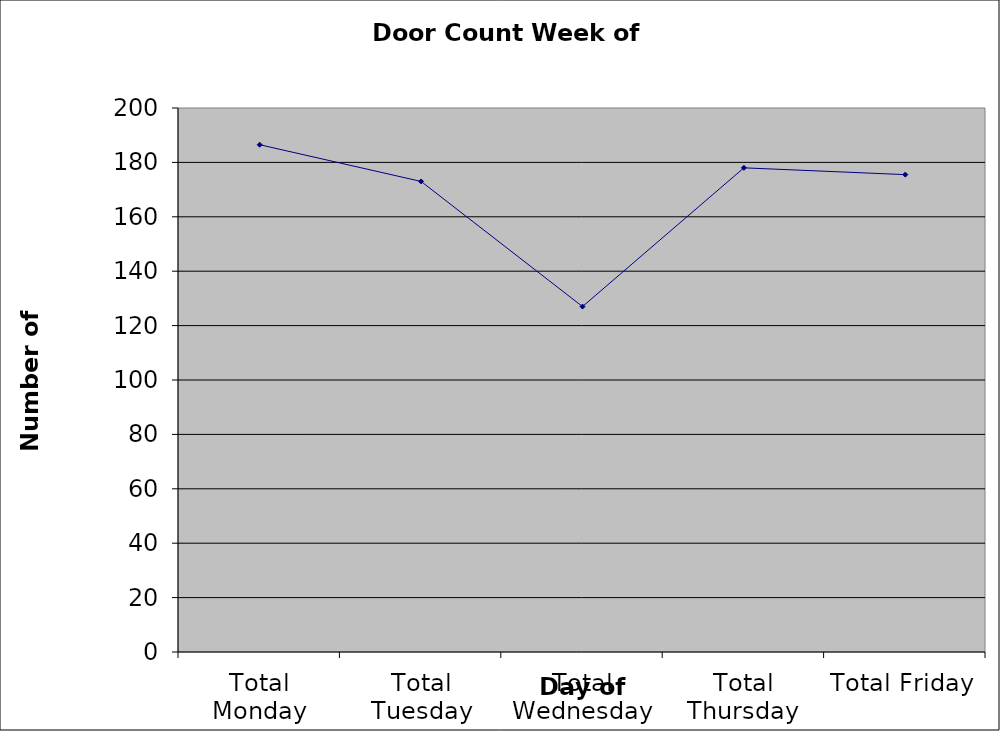
| Category | Series 0 |
|---|---|
| Total Monday | 186.5 |
| Total Tuesday | 173 |
| Total Wednesday | 127 |
| Total Thursday | 178 |
| Total Friday | 175.5 |